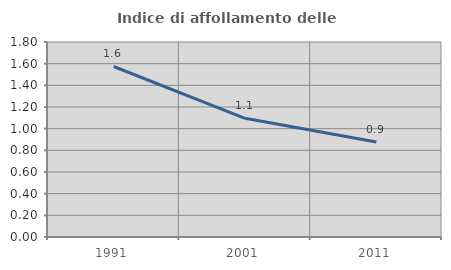
| Category | Indice di affollamento delle abitazioni  |
|---|---|
| 1991.0 | 1.574 |
| 2001.0 | 1.096 |
| 2011.0 | 0.878 |